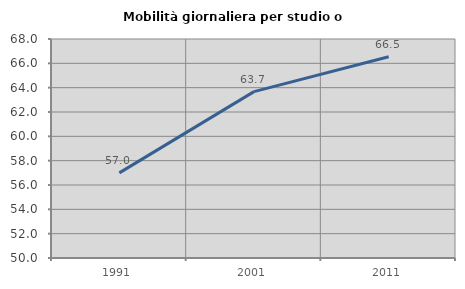
| Category | Mobilità giornaliera per studio o lavoro |
|---|---|
| 1991.0 | 56.999 |
| 2001.0 | 63.677 |
| 2011.0 | 66.54 |